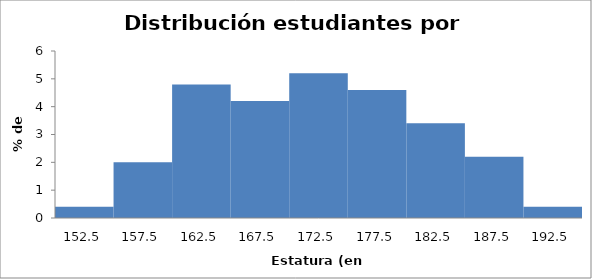
| Category | Series 0 |
|---|---|
| 152.5 | 0.4 |
| 157.5 | 2 |
| 162.5 | 4.8 |
| 167.5 | 4.2 |
| 172.5 | 5.2 |
| 177.5 | 4.6 |
| 182.5 | 3.4 |
| 187.5 | 2.2 |
| 192.5 | 0.4 |